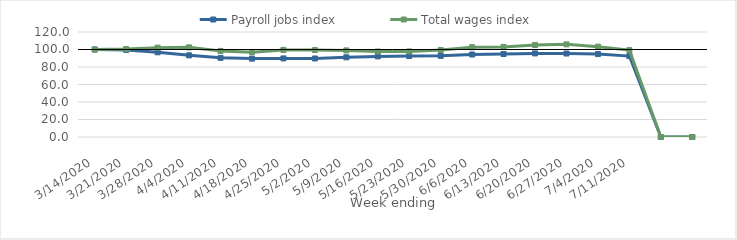
| Category | Payroll jobs index | Total wages index |
|---|---|---|
| 14/03/2020 | 100 | 100 |
| 21/03/2020 | 99.529 | 100.553 |
| 28/03/2020 | 96.81 | 102.142 |
| 04/04/2020 | 93.349 | 102.445 |
| 11/04/2020 | 90.444 | 98.378 |
| 18/04/2020 | 89.589 | 96.829 |
| 25/04/2020 | 89.812 | 99.524 |
| 02/05/2020 | 89.73 | 99.386 |
| 09/05/2020 | 91.087 | 98.98 |
| 16/05/2020 | 92.118 | 97.705 |
| 23/05/2020 | 92.529 | 97.804 |
| 30/05/2020 | 92.764 | 99.422 |
| 06/06/2020 | 94.278 | 102.653 |
| 13/06/2020 | 94.892 | 102.998 |
| 20/06/2020 | 95.553 | 105.172 |
| 27/06/2020 | 95.407 | 105.874 |
| 04/07/2020 | 94.756 | 103.234 |
| 11/07/2020 | 92.486 | 99.29 |